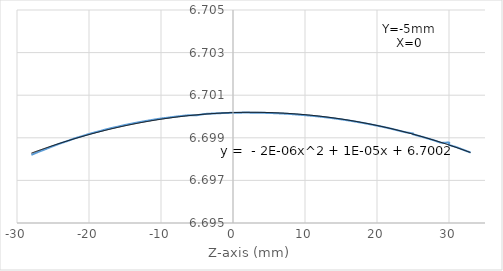
| Category | Series 0 |
|---|---|
| -28.0 | 6.698 |
| -27.0 | 6.698 |
| -26.0 | 6.698 |
| -25.0 | 6.699 |
| -25.0 | 6.699 |
| -24.0 | 6.699 |
| -23.0 | 6.699 |
| -22.0 | 6.699 |
| -21.0 | 6.699 |
| -20.0 | 6.699 |
| -19.0 | 6.699 |
| -18.0 | 6.699 |
| -18.0 | 6.699 |
| -17.0 | 6.699 |
| -16.0 | 6.7 |
| -15.0 | 6.7 |
| -14.0 | 6.7 |
| -13.0 | 6.7 |
| -12.0 | 6.7 |
| -11.0 | 6.7 |
| -10.0 | 6.7 |
| -9.0 | 6.7 |
| -8.0 | 6.7 |
| -7.0 | 6.7 |
| -6.0 | 6.7 |
| -5.0 | 6.7 |
| -4.0 | 6.7 |
| -3.0 | 6.7 |
| -2.0 | 6.7 |
| -1.0 | 6.7 |
| 0.0 | 6.7 |
| 1.0 | 6.7 |
| 2.0 | 6.7 |
| 2.0 | 6.7 |
| 3.0 | 6.7 |
| 4.0 | 6.7 |
| 5.0 | 6.7 |
| 6.0 | 6.7 |
| 7.0 | 6.7 |
| 8.0 | 6.7 |
| 9.0 | 6.7 |
| 10.0 | 6.7 |
| 11.0 | 6.7 |
| 12.0 | 6.7 |
| 13.0 | 6.7 |
| 14.0 | 6.7 |
| 15.0 | 6.7 |
| 16.0 | 6.7 |
| 17.0 | 6.7 |
| 18.0 | 6.7 |
| 19.0 | 6.7 |
| 20.0 | 6.7 |
| 20.0 | 6.7 |
| 21.0 | 6.7 |
| 22.0 | 6.699 |
| 23.0 | 6.699 |
| 24.0 | 6.699 |
| 25.0 | 6.699 |
| 25.0 | 6.699 |
| 26.0 | 6.699 |
| 27.0 | 6.699 |
| 28.0 | 6.699 |
| 29.0 | 6.699 |
| 30.0 | 6.699 |
| 30.0 | 6.699 |
| 31.0 | 6.699 |
| 32.0 | 6.698 |
| 33.0 | 6.698 |